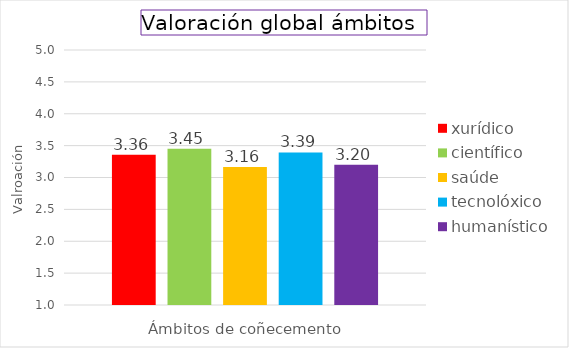
| Category | xurídico | científico | saúde | tecnolóxico | humanístico |
|---|---|---|---|---|---|
| Índice | 3.356 | 3.451 | 3.163 | 3.393 | 3.199 |